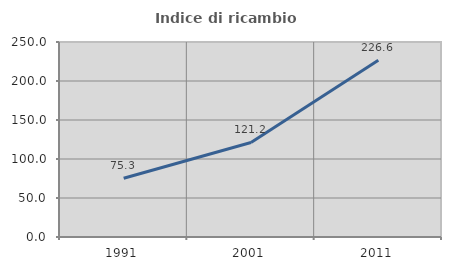
| Category | Indice di ricambio occupazionale  |
|---|---|
| 1991.0 | 75.253 |
| 2001.0 | 121.176 |
| 2011.0 | 226.633 |